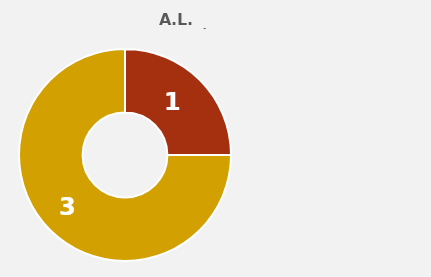
| Category | A.L. FONTIBÓN |
|---|---|
| PQRS Vencidas | 1 |
| PQRS con Respuesta Exemporánea | 3 |